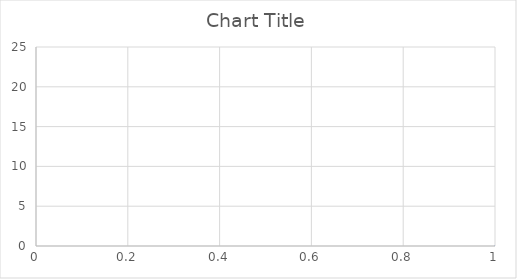
| Category | Series 0 |
|---|---|
| 0 | 0 |
| 1 | 19.247 |
| 2 | 19.247 |
| 3 | 19.247 |
| 4 | 19.247 |
| 5 | 19.247 |
| 6 | 19.246 |
| 7 | 19.25 |
| 8 | 19.254 |
| 9 | 19.244 |
| 10 | 19.249 |
| 11 | 19.253 |
| 12 | 19.253 |
| 13 | 19.253 |
| 14 | 19.253 |
| 15 | 19.252 |
| 16 | 19.252 |
| 17 | 19.252 |
| 18 | 19.252 |
| 19 | 19.252 |
| 20 | 19.253 |
| 21 | 19.253 |
| 22 | 19.253 |
| 23 | 19.252 |
| 24 | 19.252 |
| 25 | 19.253 |
| 26 | 19.252 |
| 27 | 19.252 |
| 28 | 19.252 |
| 29 | 19.251 |
| 30 | 19.251 |
| 31 | 19.251 |
| 32 | 19.251 |
| 33 | 19.25 |
| 34 | 19.25 |
| 35 | 19.25 |
| 36 | 19.25 |
| 37 | 19.25 |
| 38 | 19.25 |
| 39 | 19.251 |
| 40 | 19.252 |
| 41 | 19.253 |
| 42 | 19.253 |
| 43 | 19.254 |
| 44 | 19.254 |
| 45 | 19.254 |
| 46 | 19.254 |
| 47 | 19.25 |
| 48 | 19.246 |
| 49 | 19.255 |
| 50 | 19.251 |
| 51 | 19.247 |
| 52 | 19.247 |
| 53 | 19.251 |
| 54 | 19.255 |
| 55 | 19.254 |
| 56 | 19.254 |
| 57 | 19.254 |
| 58 | 19.254 |
| 59 | 19.254 |
| 60 | 19.254 |
| 61 | 19.254 |
| 62 | 19.249 |
| 63 | 19.244 |
| 64 | 19.254 |
| 65 | 19.253 |
| 66 | 19.253 |
| 67 | 19.252 |
| 68 | 19.252 |
| 69 | 19.252 |
| 70 | 19.251 |
| 71 | 19.251 |
| 72 | 19.251 |
| 73 | 19.251 |
| 74 | 19.25 |
| 75 | 19.25 |
| 76 | 19.25 |
| 77 | 19.25 |
| 78 | 19.25 |
| 79 | 19.254 |
| 80 | 19.259 |
| 81 | 19.25 |
| 82 | 19.25 |
| 83 | 19.25 |
| 84 | 19.25 |
| 85 | 19.254 |
| 86 | 19.259 |
| 87 | 19.25 |
| 88 | 19.249 |
| 89 | 19.249 |
| 90 | 19.249 |
| 91 | 19.249 |
| 92 | 19.248 |
| 93 | 19.248 |
| 94 | 19.248 |
| 95 | 19.248 |
| 96 | 19.248 |
| 97 | 19.248 |
| 98 | 19.247 |
| 99 | 19.247 |
| 100 | 19.247 |
| 101 | 19.248 |
| 102 | 19.248 |
| 103 | 19.248 |
| 104 | 19.248 |
| 105 | 19.248 |
| 106 | 19.248 |
| 107 | 19.248 |
| 108 | 19.248 |
| 109 | 19.247 |
| 110 | 19.248 |
| 111 | 19.248 |
| 112 | 19.247 |
| 113 | 19.247 |
| 114 | 19.246 |
| 115 | 19.246 |
| 116 | 19.244 |
| 117 | 19.244 |
| 118 | 19.244 |
| 119 | 19.251 |
| 120 | 19.251 |
| 121 | 19.251 |
| 122 | 19.249 |
| 123 | 19.249 |
| 124 | 19.248 |
| 125 | 19.248 |
| 126 | 19.247 |
| 127 | 19.247 |
| 128 | 19.246 |
| 129 | 19.246 |
| 130 | 19.245 |
| 131 | 19.244 |
| 132 | 19.244 |
| 133 | 19.253 |
| 134 | 19.253 |
| 135 | 19.252 |
| 136 | 19.252 |
| 137 | 19.251 |
| 138 | 19.251 |
| 139 | 19.25 |
| 140 | 19.25 |
| 141 | 19.25 |
| 142 | 19.249 |
| 143 | 19.249 |
| 144 | 19.248 |
| 145 | 19.248 |
| 146 | 19.247 |
| 147 | 19.247 |
| 148 | 19.247 |
| 149 | 19.247 |
| 150 | 19.246 |
| 151 | 19.246 |
| 152 | 19.246 |
| 153 | 19.246 |
| 154 | 19.246 |
| 155 | 19.245 |
| 156 | 19.254 |
| 157 | 19.254 |
| 158 | 19.254 |
| 159 | 19.254 |
| 160 | 19.254 |
| 161 | 19.254 |
| 162 | 19.254 |
| 163 | 19.254 |
| 164 | 19.254 |
| 165 | 19.254 |
| 166 | 19.25 |
| 167 | 19.245 |
| 168 | 19.254 |
| 169 | 19.254 |
| 170 | 19.254 |
| 171 | 19.253 |
| 172 | 19.253 |
| 173 | 19.253 |
| 174 | 19.252 |
| 175 | 19.252 |
| 176 | 19.251 |
| 177 | 19.251 |
| 178 | 19.251 |
| 179 | 19.25 |
| 180 | 19.25 |
| 181 | 19.25 |
| 182 | 19.249 |
| 183 | 19.249 |
| 184 | 19.249 |
| 185 | 19.248 |
| 186 | 19.248 |
| 187 | 19.248 |
| 188 | 19.247 |
| 189 | 19.247 |
| 190 | 19.247 |
| 191 | 19.247 |
| 192 | 19.247 |
| 193 | 19.247 |
| 194 | 19.246 |
| 195 | 19.246 |
| 196 | 19.246 |
| 197 | 19.246 |
| 198 | 19.246 |
| 199 | 19.246 |
| 200 | 19.247 |
| 201 | 19.246 |
| 202 | 19.246 |
| 203 | 19.246 |
| 204 | 19.246 |
| 205 | 19.255 |
| 206 | 19.251 |
| 207 | 19.246 |
| 208 | 19.247 |
| 209 | 19.246 |
| 210 | 19.246 |
| 211 | 19.246 |
| 212 | 19.246 |
| 213 | 19.246 |
| 214 | 19.247 |
| 215 | 19.246 |
| 216 | 19.246 |
| 217 | 19.247 |
| 218 | 19.247 |
| 219 | 19.247 |
| 220 | 19.247 |
| 221 | 19.251 |
| 222 | 19.255 |
| 223 | 19.255 |
| 224 | 19.25 |
| 225 | 19.245 |
| 226 | 19.254 |
| 227 | 19.254 |
| 228 | 19.254 |
| 229 | 19.249 |
| 230 | 19.244 |
| 231 | 19.253 |
| 232 | 19.252 |
| 233 | 19.252 |
| 234 | 19.252 |
| 235 | 19.252 |
| 236 | 19.252 |
| 237 | 19.251 |
| 238 | 19.251 |
| 239 | 19.251 |
| 240 | 19.251 |
| 241 | 19.251 |
| 242 | 19.251 |
| 243 | 19.251 |
| 244 | 19.251 |
| 245 | 19.251 |
| 246 | 19.251 |
| 247 | 19.251 |
| 248 | 19.251 |
| 249 | 19.251 |
| 250 | 19.251 |
| 251 | 19.251 |
| 252 | 19.251 |
| 253 | 19.251 |
| 254 | 19.251 |
| 255 | 19.251 |
| 256 | 19.251 |
| 257 | 19.251 |
| 258 | 19.25 |
| 259 | 19.25 |
| 260 | 19.25 |
| 261 | 19.25 |
| 262 | 19.25 |
| 263 | 19.25 |
| 264 | 19.25 |
| 265 | 19.25 |
| 266 | 19.25 |
| 267 | 19.25 |
| 268 | 19.251 |
| 269 | 19.251 |
| 270 | 19.251 |
| 271 | 19.251 |
| 272 | 19.252 |
| 273 | 19.252 |
| 274 | 19.252 |
| 275 | 19.253 |
| 276 | 19.253 |
| 277 | 19.253 |
| 278 | 19.244 |
| 279 | 19.244 |
| 280 | 19.253 |
| 281 | 19.253 |
| 282 | 19.253 |
| 283 | 19.243 |
| 284 | 19.248 |
| 285 | 19.252 |
| 286 | 19.252 |
| 287 | 19.252 |
| 288 | 19.252 |
| 289 | 19.251 |
| 290 | 19.251 |
| 291 | 19.251 |
| 292 | 19.251 |
| 293 | 19.25 |
| 294 | 19.25 |
| 295 | 19.25 |
| 296 | 19.25 |
| 297 | 19.25 |
| 298 | 19.25 |
| 299 | 19.249 |
| 300 | 19.249 |
| 301 | 19.249 |
| 302 | 19.249 |
| 303 | 19.249 |
| 304 | 19.249 |
| 305 | 19.249 |
| 306 | 19.248 |
| 307 | 19.248 |
| 308 | 19.248 |
| 309 | 19.248 |
| 310 | 19.247 |
| 311 | 19.247 |
| 312 | 19.247 |
| 313 | 19.252 |
| 314 | 19.256 |
| 315 | 19.248 |
| 316 | 19.248 |
| 317 | 19.248 |
| 318 | 19.248 |
| 319 | 19.248 |
| 320 | 19.248 |
| 321 | 19.248 |
| 322 | 19.248 |
| 323 | 19.248 |
| 324 | 19.248 |
| 325 | 19.248 |
| 326 | 19.249 |
| 327 | 19.25 |
| 328 | 19.249 |
| 329 | 19.249 |
| 330 | 19.249 |
| 331 | 19.249 |
| 332 | 19.248 |
| 333 | 19.249 |
| 334 | 19.249 |
| 335 | 19.248 |
| 336 | 19.248 |
| 337 | 19.248 |
| 338 | 19.256 |
| 339 | 19.252 |
| 340 | 19.247 |
| 341 | 19.247 |
| 342 | 19.247 |
| 343 | 19.247 |
| 344 | 19.247 |
| 345 | 19.247 |
| 346 | 19.247 |
| 347 | 19.256 |
| 348 | 19.256 |
| 349 | 19.256 |
| 350 | 19.256 |
| 351 | 19.256 |
| 352 | 19.256 |
| 353 | 19.247 |
| 354 | 19.252 |
| 355 | 19.257 |
| 356 | 19.252 |
| 357 | 19.248 |
| 358 | 19.248 |
| 359 | 19.247 |
| 360 | 19.247 |
| 361 | 19.247 |
| 362 | 19.247 |
| 363 | 19.247 |
| 364 | 19.256 |
| 365 | 19.252 |
| 366 | 19.248 |
| 367 | 19.248 |
| 368 | 19.248 |
| 369 | 19.248 |
| 370 | 19.249 |
| 371 | 19.249 |
| 372 | 19.25 |
| 373 | 19.25 |
| 374 | 19.25 |
| 375 | 19.251 |
| 376 | 19.251 |
| 377 | 19.251 |
| 378 | 19.252 |
| 379 | 19.253 |
| 380 | 19.253 |
| 381 | 19.253 |
| 382 | 19.254 |
| 383 | 19.254 |
| 384 | 19.254 |
| 385 | 19.255 |
| 386 | 19.255 |
| 387 | 19.255 |
| 388 | 19.251 |
| 389 | 19.247 |
| 390 | 19.246 |
| 391 | 19.246 |
| 392 | 19.246 |
| 393 | 19.254 |
| 394 | 19.25 |
| 395 | 19.245 |
| 396 | 19.245 |
| 397 | 19.249 |
| 398 | 19.254 |
| 399 | 19.254 |
| 400 | 19.254 |
| 401 | 19.254 |
| 402 | 19.254 |
| 403 | 19.254 |
| 404 | 19.254 |
| 405 | 19.254 |
| 406 | 19.254 |
| 407 | 19.254 |
| 408 | 19.254 |
| 409 | 19.254 |
| 410 | 19.254 |
| 411 | 19.254 |
| 412 | 19.254 |
| 413 | 19.255 |
| 414 | 19.255 |
| 415 | 19.255 |
| 416 | 19.255 |
| 417 | 19.256 |
| 418 | 19.256 |
| 419 | 19.246 |
| 420 | 19.251 |
| 421 | 19.255 |
| 422 | 19.245 |
| 423 | 19.25 |
| 424 | 19.254 |
| 425 | 19.254 |
| 426 | 19.253 |
| 427 | 19.253 |
| 428 | 19.253 |
| 429 | 19.253 |
| 430 | 19.253 |
| 431 | 19.253 |
| 432 | 19.252 |
| 433 | 19.252 |
| 434 | 19.252 |
| 435 | 19.252 |
| 436 | 19.252 |
| 437 | 19.251 |
| 438 | 19.251 |
| 439 | 19.251 |
| 440 | 19.251 |
| 441 | 19.251 |
| 442 | 19.25 |
| 443 | 19.25 |
| 444 | 19.25 |
| 445 | 19.249 |
| 446 | 19.249 |
| 447 | 19.248 |
| 448 | 19.248 |
| 449 | 19.248 |
| 450 | 19.248 |
| 451 | 19.248 |
| 452 | 19.247 |
| 453 | 19.247 |
| 454 | 19.247 |
| 455 | 19.247 |
| 456 | 19.247 |
| 457 | 19.256 |
| 458 | 19.256 |
| 459 | 19.255 |
| 460 | 19.251 |
| 461 | 19.246 |
| 462 | 19.246 |
| 463 | 19.245 |
| 464 | 19.245 |
| 465 | 19.245 |
| 466 | 19.249 |
| 467 | 19.253 |
| 468 | 19.253 |
| 469 | 19.249 |
| 470 | 19.244 |
| 471 | 19.253 |
| 472 | 19.252 |
| 473 | 19.252 |
| 474 | 19.252 |
| 475 | 19.252 |
| 476 | 19.252 |
| 477 | 19.251 |
| 478 | 19.251 |
| 479 | 19.251 |
| 480 | 19.25 |
| 481 | 19.25 |
| 482 | 19.25 |
| 483 | 19.25 |
| 484 | 19.25 |
| 485 | 19.25 |
| 486 | 19.249 |
| 487 | 19.249 |
| 488 | 19.249 |
| 489 | 19.249 |
| 490 | 19.249 |
| 491 | 19.248 |
| 492 | 19.248 |
| 493 | 19.248 |
| 494 | 19.248 |
| 495 | 19.248 |
| 496 | 19.247 |
| 497 | 19.247 |
| 498 | 19.247 |
| 499 | 19.247 |
| 500 | 19.246 |
| 501 | 19.246 |
| 502 | 19.246 |
| 503 | 19.245 |
| 504 | 19.245 |
| 505 | 19.245 |
| 506 | 19.254 |
| 507 | 19.254 |
| 508 | 19.254 |
| 509 | 19.244 |
| 510 | 19.249 |
| 511 | 19.253 |
| 512 | 19.244 |
| 513 | 19.249 |
| 514 | 19.253 |
| 515 | 19.253 |
| 516 | 19.253 |
| 517 | 19.253 |
| 518 | 19.253 |
| 519 | 19.253 |
| 520 | 19.253 |
| 521 | 19.253 |
| 522 | 19.253 |
| 523 | 19.252 |
| 524 | 19.252 |
| 525 | 19.252 |
| 526 | 19.251 |
| 527 | 19.251 |
| 528 | 19.251 |
| 529 | 19.25 |
| 530 | 19.25 |
| 531 | 19.25 |
| 532 | 19.249 |
| 533 | 19.249 |
| 534 | 19.249 |
| 535 | 19.249 |
| 536 | 19.249 |
| 537 | 19.249 |
| 538 | 19.249 |
| 539 | 19.249 |
| 540 | 19.249 |
| 541 | 19.249 |
| 542 | 19.249 |
| 543 | 19.249 |
| 544 | 19.249 |
| 545 | 19.249 |
| 546 | 19.249 |
| 547 | 19.249 |
| 548 | 19.249 |
| 549 | 19.249 |
| 550 | 19.249 |
| 551 | 19.249 |
| 552 | 19.249 |
| 553 | 19.249 |
| 554 | 19.249 |
| 555 | 19.249 |
| 556 | 19.249 |
| 557 | 19.249 |
| 558 | 19.249 |
| 559 | 19.249 |
| 560 | 19.249 |
| 561 | 19.248 |
| 562 | 19.248 |
| 563 | 19.248 |
| 564 | 19.248 |
| 565 | 19.248 |
| 566 | 19.248 |
| 567 | 19.248 |
| 568 | 19.248 |
| 569 | 19.248 |
| 570 | 19.248 |
| 571 | 19.248 |
| 572 | 19.247 |
| 573 | 19.247 |
| 574 | 19.247 |
| 575 | 19.247 |
| 576 | 19.247 |
| 577 | 19.247 |
| 578 | 19.246 |
| 579 | 19.246 |
| 580 | 19.246 |
| 581 | 19.246 |
| 582 | 19.246 |
| 583 | 19.246 |
| 584 | 19.256 |
| 585 | 19.251 |
| 586 | 19.246 |
| 587 | 19.246 |
| 588 | 19.246 |
| 589 | 19.246 |
| 590 | 19.246 |
| 591 | 19.246 |
| 592 | 19.246 |
| 593 | 19.246 |
| 594 | 19.246 |
| 595 | 19.255 |
| 596 | 19.251 |
| 597 | 19.246 |
| 598 | 19.246 |
| 599 | 19.246 |
| 600 | 19.246 |
| 601 | 19.247 |
| 602 | 19.247 |
| 603 | 19.247 |
| 604 | 19.247 |
| 605 | 19.247 |
| 606 | 19.247 |
| 607 | 19.248 |
| 608 | 19.248 |
| 609 | 19.248 |
| 610 | 19.248 |
| 611 | 19.248 |
| 612 | 19.248 |
| 613 | 19.248 |
| 614 | 19.248 |
| 615 | 19.248 |
| 616 | 19.249 |
| 617 | 19.249 |
| 618 | 19.249 |
| 619 | 19.249 |
| 620 | 19.249 |
| 621 | 19.249 |
| 622 | 19.249 |
| 623 | 19.25 |
| 624 | 19.25 |
| 625 | 19.25 |
| 626 | 19.25 |
| 627 | 19.251 |
| 628 | 19.251 |
| 629 | 19.251 |
| 630 | 19.251 |
| 631 | 19.251 |
| 632 | 19.252 |
| 633 | 19.252 |
| 634 | 19.252 |
| 635 | 19.252 |
| 636 | 19.252 |
| 637 | 19.251 |
| 638 | 19.251 |
| 639 | 19.251 |
| 640 | 19.251 |
| 641 | 19.251 |
| 642 | 19.251 |
| 643 | 19.251 |
| 644 | 19.251 |
| 645 | 19.251 |
| 646 | 19.251 |
| 647 | 19.251 |
| 648 | 19.251 |
| 649 | 19.251 |
| 650 | 19.251 |
| 651 | 19.251 |
| 652 | 19.251 |
| 653 | 19.25 |
| 654 | 19.25 |
| 655 | 19.25 |
| 656 | 19.25 |
| 657 | 19.25 |
| 658 | 19.249 |
| 659 | 19.249 |
| 660 | 19.249 |
| 661 | 19.248 |
| 662 | 19.248 |
| 663 | 19.248 |
| 664 | 19.247 |
| 665 | 19.246 |
| 666 | 19.246 |
| 667 | 19.246 |
| 668 | 19.245 |
| 669 | 19.245 |
| 670 | 19.244 |
| 671 | 19.139 |
| 672 | 19.033 |
| 673 | 19.094 |
| 674 | 19.034 |
| 675 | 18.974 |
| 676 | 18.97 |
| 677 | 18.999 |
| 678 | 19.029 |
| 679 | 19.071 |
| 680 | 19.092 |
| 681 | 19.113 |
| 682 | 19.15 |
| 683 | 19.167 |
| 684 | 19.183 |
| 685 | 19.212 |
| 686 | 19.21 |
| 687 | 19.207 |
| 688 | 19.204 |
| 689 | 19.21 |
| 690 | 19.216 |
| 691 | 19.221 |
| 692 | 19.221 |
| 693 | 19.227 |
| 694 | 19.239 |
| 695 | 19.238 |
| 696 | 19.236 |
| 697 | 19.239 |
| 698 | 19.242 |
| 699 | 19.249 |
| 700 | 19.254 |
| 701 | 19.259 |
| 702 | 19.263 |
| 703 | 19.266 |
| 704 | 19.269 |
| 705 | 19.268 |
| 706 | 19.272 |
| 707 | 19.277 |
| 708 | 19.277 |
| 709 | 19.277 |
| 710 | 19.277 |
| 711 | 19.277 |
| 712 | 19.272 |
| 713 | 19.267 |
| 714 | 19.268 |
| 715 | 19.263 |
| 716 | 19.259 |
| 717 | 19.259 |
| 718 | 19.255 |
| 719 | 19.25 |
| 720 | 19.241 |
| 721 | 19.241 |
| 722 | 19.241 |
| 723 | 19.24 |
| 724 | 19.235 |
| 725 | 19.231 |
| 726 | 19.23 |
| 727 | 19.23 |
| 728 | 19.23 |
| 729 | 19.23 |
| 730 | 19.23 |
| 731 | 19.23 |
| 732 | 19.23 |
| 733 | 19.231 |
| 734 | 19.24 |
| 735 | 19.241 |
| 736 | 19.241 |
| 737 | 19.25 |
| 738 | 19.246 |
| 739 | 19.241 |
| 740 | 19.25 |
| 741 | 19.255 |
| 742 | 19.259 |
| 743 | 19.249 |
| 744 | 19.249 |
| 745 | 19.249 |
| 746 | 19.249 |
| 747 | 19.249 |
| 748 | 19.249 |
| 749 | 19.249 |
| 750 | 19.25 |
| 751 | 19.25 |
| 752 | 19.25 |
| 753 | 19.25 |
| 754 | 19.251 |
| 755 | 19.252 |
| 756 | 19.252 |
| 757 | 19.262 |
| 758 | 19.262 |
| 759 | 19.262 |
| 760 | 19.262 |
| 761 | 19.262 |
| 762 | 19.261 |
| 763 | 19.261 |
| 764 | 19.261 |
| 765 | 19.261 |
| 766 | 19.26 |
| 767 | 19.26 |
| 768 | 19.26 |
| 769 | 19.251 |
| 770 | 19.256 |
| 771 | 19.26 |
| 772 | 19.26 |
| 773 | 19.26 |
| 774 | 19.26 |
| 775 | 19.251 |
| 776 | 19.256 |
| 777 | 19.26 |
| 778 | 19.26 |
| 779 | 19.26 |
| 780 | 19.26 |
| 781 | 19.26 |
| 782 | 19.26 |
| 783 | 19.259 |
| 784 | 19.264 |
| 785 | 19.268 |
| 786 | 19.259 |
| 787 | 19.259 |
| 788 | 19.259 |
| 789 | 19.259 |
| 790 | 19.259 |
| 791 | 19.259 |
| 792 | 19.259 |
| 793 | 19.259 |
| 794 | 19.26 |
| 795 | 19.26 |
| 796 | 19.26 |
| 797 | 19.26 |
| 798 | 19.26 |
| 799 | 19.26 |
| 800 | 19.259 |
| 801 | 19.268 |
| 802 | 19.268 |
| 803 | 19.268 |
| 804 | 19.268 |
| 805 | 19.268 |
| 806 | 19.268 |
| 807 | 19.264 |
| 808 | 19.259 |
| 809 | 19.269 |
| 810 | 19.264 |
| 811 | 19.26 |
| 812 | 19.26 |
| 813 | 19.261 |
| 814 | 19.261 |
| 815 | 19.262 |
| 816 | 19.262 |
| 817 | 19.262 |
| 818 | 19.263 |
| 819 | 19.263 |
| 820 | 19.263 |
| 821 | 19.263 |
| 822 | 19.263 |
| 823 | 19.263 |
| 824 | 19.263 |
| 825 | 19.263 |
| 826 | 19.263 |
| 827 | 19.263 |
| 828 | 19.263 |
| 829 | 19.264 |
| 830 | 19.265 |
| 831 | 19.265 |
| 832 | 19.265 |
| 833 | 19.266 |
| 834 | 19.267 |
| 835 | 19.268 |
| 836 | 19.269 |
| 837 | 19.27 |
| 838 | 19.262 |
| 839 | 19.262 |
| 840 | 19.263 |
| 841 | 19.263 |
| 842 | 19.268 |
| 843 | 19.273 |
| 844 | 19.273 |
| 845 | 19.273 |
| 846 | 19.273 |
| 847 | 19.273 |
| 848 | 19.273 |
| 849 | 19.272 |
| 850 | 19.272 |
| 851 | 19.272 |
| 852 | 19.272 |
| 853 | 19.271 |
| 854 | 19.271 |
| 855 | 19.271 |
| 856 | 19.272 |
| 857 | 19.272 |
| 858 | 19.272 |
| 859 | 19.272 |
| 860 | 19.272 |
| 861 | 19.273 |
| 862 | 19.273 |
| 863 | 19.273 |
| 864 | 19.282 |
| 865 | 19.278 |
| 866 | 19.273 |
| 867 | 19.273 |
| 868 | 19.273 |
| 869 | 19.273 |
| 870 | 19.274 |
| 871 | 19.278 |
| 872 | 19.283 |
| 873 | 19.283 |
| 874 | 19.278 |
| 875 | 19.274 |
| 876 | 19.283 |
| 877 | 19.278 |
| 878 | 19.273 |
| 879 | 19.273 |
| 880 | 19.278 |
| 881 | 19.283 |
| 882 | 19.283 |
| 883 | 19.283 |
| 884 | 19.283 |
| 885 | 19.279 |
| 886 | 19.274 |
| 887 | 19.284 |
| 888 | 19.28 |
| 889 | 19.275 |
| 890 | 19.285 |
| 891 | 19.281 |
| 892 | 19.277 |
| 893 | 19.277 |
| 894 | 19.278 |
| 895 | 19.278 |
| 896 | 19.279 |
| 897 | 19.279 |
| 898 | 19.28 |
| 899 | 19.289 |
| 900 | 19.285 |
| 901 | 19.28 |
| 902 | 19.289 |
| 903 | 19.285 |
| 904 | 19.281 |
| 905 | 19.281 |
| 906 | 19.281 |
| 907 | 19.282 |
| 908 | 19.283 |
| 909 | 19.284 |
| 910 | 19.285 |
| 911 | 19.286 |
| 912 | 19.287 |
| 913 | 19.288 |
| 914 | 19.289 |
| 915 | 19.29 |
| 916 | 19.282 |
| 917 | 19.283 |
| 918 | 19.284 |
| 919 | 19.284 |
| 920 | 19.285 |
| 921 | 19.285 |
| 922 | 19.295 |
| 923 | 19.295 |
| 924 | 19.295 |
| 925 | 19.294 |
| 926 | 19.294 |
| 927 | 19.294 |
| 928 | 19.284 |
| 929 | 19.285 |
| 930 | 19.285 |
| 931 | 19.295 |
| 932 | 19.291 |
| 933 | 19.287 |
| 934 | 19.289 |
| 935 | 19.289 |
| 936 | 19.29 |
| 937 | 19.29 |
| 938 | 19.29 |
| 939 | 19.291 |
| 940 | 19.291 |
| 941 | 19.291 |
| 942 | 19.29 |
| 943 | 19.295 |
| 944 | 19.299 |
| 945 | 19.298 |
| 946 | 19.297 |
| 947 | 19.297 |
| 948 | 19.296 |
| 949 | 19.296 |
| 950 | 19.295 |
| 951 | 19.295 |
| 952 | 19.296 |
| 953 | 19.297 |
| 954 | 19.298 |
| 955 | 19.298 |
| 956 | 19.299 |
| 957 | 19.291 |
| 958 | 19.296 |
| 959 | 19.301 |
| 960 | 19.302 |
| 961 | 19.302 |
| 962 | 19.303 |
| 963 | 19.303 |
| 964 | 19.303 |
| 965 | 19.302 |
| 966 | 19.301 |
| 967 | 19.301 |
| 968 | 19.3 |
| 969 | 19.299 |
| 970 | 19.298 |
| 971 | 19.305 |
| 972 | 19.304 |
| 973 | 19.302 |
| 974 | 19.301 |
| 975 | 19.301 |
| 976 | 19.3 |
| 977 | 19.299 |
| 978 | 19.298 |
| 979 | 19.298 |
| 980 | 19.307 |
| 981 | 19.306 |
| 982 | 19.306 |
| 983 | 19.305 |
| 984 | 19.304 |
| 985 | 19.304 |
| 986 | 19.304 |
| 987 | 19.304 |
| 988 | 19.304 |
| 989 | 19.304 |
| 990 | 19.303 |
| 991 | 19.303 |
| 992 | 19.303 |
| 993 | 19.302 |
| 994 | 19.302 |
| 995 | 19.302 |
| 996 | 19.301 |
| 997 | 19.301 |
| 998 | 19.302 |
| 999 | 19.302 |
| 1000 | 19.302 |
| 1001 | 19.303 |
| 1002 | 19.303 |
| 1003 | 19.304 |
| 1004 | 19.304 |
| 1005 | 19.304 |
| 1006 | 19.305 |
| 1007 | 19.305 |
| 1008 | 19.305 |
| 1009 | 19.306 |
| 1010 | 19.306 |
| 1011 | 19.306 |
| 1012 | 19.307 |
| 1013 | 19.307 |
| 1014 | 19.307 |
| 1015 | 19.307 |
| 1016 | 19.307 |
| 1017 | 19.308 |
| 1018 | 19.308 |
| 1019 | 19.309 |
| 1020 | 19.31 |
| 1021 | 19.31 |
| 1022 | 19.31 |
| 1023 | 19.311 |
| 1024 | 19.312 |
| 1025 | 19.312 |
| 1026 | 19.313 |
| 1027 | 19.314 |
| 1028 | 19.315 |
| 1029 | 19.316 |
| 1030 | 19.316 |
| 1031 | 19.316 |
| 1032 | 19.309 |
| 1033 | 19.314 |
| 1034 | 19.32 |
| 1035 | 19.311 |
| 1036 | 19.312 |
| 1037 | 19.313 |
| 1038 | 19.305 |
| 1039 | 19.31 |
| 1040 | 19.316 |
| 1041 | 19.312 |
| 1042 | 19.308 |
| 1043 | 19.309 |
| 1044 | 19.311 |
| 1045 | 19.311 |
| 1046 | 19.312 |
| 1047 | 19.311 |
| 1048 | 19.311 |
| 1049 | 19.311 |
| 1050 | 19.311 |
| 1051 | 19.311 |
| 1052 | 19.311 |
| 1053 | 19.316 |
| 1054 | 19.321 |
| 1055 | 19.312 |
| 1056 | 19.312 |
| 1057 | 19.313 |
| 1058 | 19.314 |
| 1059 | 19.314 |
| 1060 | 19.315 |
| 1061 | 19.316 |
| 1062 | 19.316 |
| 1063 | 19.317 |
| 1064 | 19.318 |
| 1065 | 19.314 |
| 1066 | 19.309 |
| 1067 | 19.31 |
| 1068 | 19.311 |
| 1069 | 19.312 |
| 1070 | 19.313 |
| 1071 | 19.313 |
| 1072 | 19.314 |
| 1073 | 19.315 |
| 1074 | 19.315 |
| 1075 | 19.315 |
| 1076 | 19.316 |
| 1077 | 19.316 |
| 1078 | 19.317 |
| 1079 | 19.317 |
| 1080 | 19.318 |
| 1081 | 19.318 |
| 1082 | 19.318 |
| 1083 | 19.318 |
| 1084 | 19.319 |
| 1085 | 19.319 |
| 1086 | 19.319 |
| 1087 | 19.318 |
| 1088 | 19.317 |
| 1089 | 19.317 |
| 1090 | 19.317 |
| 1091 | 19.317 |
| 1092 | 19.317 |
| 1093 | 19.317 |
| 1094 | 19.317 |
| 1095 | 19.316 |
| 1096 | 19.316 |
| 1097 | 19.315 |
| 1098 | 19.315 |
| 1099 | 19.315 |
| 1100 | 19.315 |
| 1101 | 19.325 |
| 1102 | 19.324 |
| 1103 | 19.324 |
| 1104 | 19.323 |
| 1105 | 19.323 |
| 1106 | 19.323 |
| 1107 | 19.323 |
| 1108 | 19.323 |
| 1109 | 19.323 |
| 1110 | 19.323 |
| 1111 | 19.323 |
| 1112 | 19.323 |
| 1113 | 19.324 |
| 1114 | 19.323 |
| 1115 | 19.323 |
| 1116 | 19.323 |
| 1117 | 19.323 |
| 1118 | 19.323 |
| 1119 | 19.323 |
| 1120 | 19.323 |
| 1121 | 19.323 |
| 1122 | 19.323 |
| 1123 | 19.323 |
| 1124 | 19.323 |
| 1125 | 19.323 |
| 1126 | 19.323 |
| 1127 | 19.324 |
| 1128 | 19.329 |
| 1129 | 19.333 |
| 1130 | 19.324 |
| 1131 | 19.324 |
| 1132 | 19.324 |
| 1133 | 19.322 |
| 1134 | 19.322 |
| 1135 | 19.322 |
| 1136 | 19.33 |
| 1137 | 19.33 |
| 1138 | 19.329 |
| 1139 | 19.328 |
| 1140 | 19.327 |
| 1141 | 19.327 |
| 1142 | 19.326 |
| 1143 | 19.325 |
| 1144 | 19.325 |
| 1145 | 19.325 |
| 1146 | 19.324 |
| 1147 | 19.333 |
| 1148 | 19.328 |
| 1149 | 19.323 |
| 1150 | 19.331 |
| 1151 | 19.331 |
| 1152 | 19.331 |
| 1153 | 19.331 |
| 1154 | 19.332 |
| 1155 | 19.332 |
| 1156 | 19.333 |
| 1157 | 19.333 |
| 1158 | 19.334 |
| 1159 | 19.334 |
| 1160 | 19.334 |
| 1161 | 19.334 |
| 1162 | 19.334 |
| 1163 | 19.335 |
| 1164 | 19.335 |
| 1165 | 19.335 |
| 1166 | 19.336 |
| 1167 | 19.336 |
| 1168 | 19.327 |
| 1169 | 19.328 |
| 1170 | 19.329 |
| 1171 | 19.329 |
| 1172 | 19.33 |
| 1173 | 19.331 |
| 1174 | 19.332 |
| 1175 | 19.332 |
| 1176 | 19.334 |
| 1177 | 19.335 |
| 1178 | 19.335 |
| 1179 | 19.327 |
| 1180 | 19.327 |
| 1181 | 19.328 |
| 1182 | 19.329 |
| 1183 | 19.33 |
| 1184 | 19.33 |
| 1185 | 19.332 |
| 1186 | 19.332 |
| 1187 | 19.332 |
| 1188 | 19.333 |
| 1189 | 19.334 |
| 1190 | 19.335 |
| 1191 | 19.337 |
| 1192 | 19.333 |
| 1193 | 19.329 |
| 1194 | 19.333 |
| 1195 | 19.334 |
| 1196 | 19.335 |
| 1197 | 19.338 |
| 1198 | 19.334 |
| 1199 | 19.33 |
| 1200 | 19.336 |
| 1201 | 19.341 |
| 1202 | 19.333 |
| 1203 | 19.334 |
| 1204 | 19.335 |
| 1205 | 19.336 |
| 1206 | 19.337 |
| 1207 | 19.338 |
| 1208 | 19.33 |
| 1209 | 19.33 |
| 1210 | 19.331 |
| 1211 | 19.334 |
| 1212 | 19.336 |
| 1213 | 19.337 |
| 1214 | 19.339 |
| 1215 | 19.34 |
| 1216 | 19.34 |
| 1217 | 19.341 |
| 1218 | 19.342 |
| 1219 | 19.342 |
| 1220 | 19.335 |
| 1221 | 19.335 |
| 1222 | 19.336 |
| 1223 | 19.338 |
| 1224 | 19.339 |
| 1225 | 19.339 |
| 1226 | 19.34 |
| 1227 | 19.34 |
| 1228 | 19.341 |
| 1229 | 19.342 |
| 1230 | 19.342 |
| 1231 | 19.341 |
| 1232 | 19.341 |
| 1233 | 19.341 |
| 1234 | 19.34 |
| 1235 | 19.34 |
| 1236 | 19.34 |
| 1237 | 19.339 |
| 1238 | 19.344 |
| 1239 | 19.348 |
| 1240 | 19.338 |
| 1241 | 19.343 |
| 1242 | 19.347 |
| 1243 | 19.347 |
| 1244 | 19.347 |
| 1245 | 19.346 |
| 1246 | 19.344 |
| 1247 | 19.344 |
| 1248 | 19.343 |
| 1249 | 19.342 |
| 1250 | 19.342 |
| 1251 | 19.342 |
| 1252 | 19.342 |
| 1253 | 19.342 |
| 1254 | 19.341 |
| 1255 | 19.341 |
| 1256 | 19.34 |
| 1257 | 19.34 |
| 1258 | 19.344 |
| 1259 | 19.348 |
| 1260 | 19.339 |
| 1261 | 19.34 |
| 1262 | 19.34 |
| 1263 | 19.341 |
| 1264 | 19.341 |
| 1265 | 19.341 |
| 1266 | 19.341 |
| 1267 | 19.346 |
| 1268 | 19.35 |
| 1269 | 19.35 |
| 1270 | 19.35 |
| 1271 | 19.349 |
| 1272 | 19.339 |
| 1273 | 19.344 |
| 1274 | 19.348 |
| 1275 | 19.348 |
| 1276 | 19.348 |
| 1277 | 19.347 |
| 1278 | 19.347 |
| 1279 | 19.347 |
| 1280 | 19.338 |
| 1281 | 19.342 |
| 1282 | 19.346 |
| 1283 | 19.346 |
| 1284 | 19.346 |
| 1285 | 19.345 |
| 1286 | 19.344 |
| 1287 | 19.343 |
| 1288 | 19.343 |
| 1289 | 19.341 |
| 1290 | 19.34 |
| 1291 | 19.34 |
| 1292 | 19.339 |
| 1293 | 19.343 |
| 1294 | 19.347 |
| 1295 | 19.346 |
| 1296 | 19.346 |
| 1297 | 19.346 |
| 1298 | 19.345 |
| 1299 | 19.345 |
| 1300 | 19.344 |
| 1301 | 19.343 |
| 1302 | 19.343 |
| 1303 | 19.343 |
| 1304 | 19.343 |
| 1305 | 19.342 |
| 1306 | 19.341 |
| 1307 | 19.341 |
| 1308 | 19.341 |
| 1309 | 19.342 |
| 1310 | 19.341 |
| 1311 | 19.341 |
| 1312 | 19.341 |
| 1313 | 19.341 |
| 1314 | 19.341 |
| 1315 | 19.35 |
| 1316 | 19.35 |
| 1317 | 19.35 |
| 1318 | 19.35 |
| 1319 | 19.35 |
| 1320 | 19.35 |
| 1321 | 19.342 |
| 1322 | 19.342 |
| 1323 | 19.343 |
| 1324 | 19.344 |
| 1325 | 19.345 |
| 1326 | 19.345 |
| 1327 | 19.347 |
| 1328 | 19.348 |
| 1329 | 19.348 |
| 1330 | 19.349 |
| 1331 | 19.35 |
| 1332 | 19.351 |
| 1333 | 19.347 |
| 1334 | 19.344 |
| 1335 | 19.345 |
| 1336 | 19.345 |
| 1337 | 19.345 |
| 1338 | 19.347 |
| 1339 | 19.348 |
| 1340 | 19.349 |
| 1341 | 19.342 |
| 1342 | 19.344 |
| 1343 | 19.345 |
| 1344 | 19.347 |
| 1345 | 19.348 |
| 1346 | 19.349 |
| 1347 | 19.351 |
| 1348 | 19.348 |
| 1349 | 19.344 |
| 1350 | 19.347 |
| 1351 | 19.348 |
| 1352 | 19.35 |
| 1353 | 19.343 |
| 1354 | 19.344 |
| 1355 | 19.345 |
| 1356 | 19.346 |
| 1357 | 19.347 |
| 1358 | 19.341 |
| 1359 | 19.343 |
| 1360 | 19.344 |
| 1361 | 19.348 |
| 1362 | 19.349 |
| 1363 | 19.351 |
| 1364 | 19.345 |
| 1365 | 19.35 |
| 1366 | 19.35 |
| 1367 | 19.344 |
| 1368 | 19.346 |
| 1369 | 19.347 |
| 1370 | 19.348 |
| 1371 | 19.349 |
| 1372 | 19.35 |
| 1373 | 19.352 |
| 1374 | 19.348 |
| 1375 | 19.345 |
| 1376 | 19.346 |
| 1377 | 19.346 |
| 1378 | 19.346 |
| 1379 | 19.347 |
| 1380 | 19.349 |
| 1381 | 19.35 |
| 1382 | 19.35 |
| 1383 | 19.35 |
| 1384 | 19.349 |
| 1385 | 19.349 |
| 1386 | 19.349 |
| 1387 | 19.347 |
| 1388 | 19.347 |
| 1389 | 19.347 |
| 1390 | 19.349 |
| 1391 | 19.348 |
| 1392 | 19.347 |
| 1393 | 19.347 |
| 1394 | 19.347 |
| 1395 | 19.347 |
| 1396 | 19.347 |
| 1397 | 19.347 |
| 1398 | 19.346 |
| 1399 | 19.355 |
| 1400 | 19.351 |
| 1401 | 19.346 |
| 1402 | 19.354 |
| 1403 | 19.354 |
| 1404 | 19.353 |
| 1405 | 19.353 |
| 1406 | 19.352 |
| 1407 | 19.352 |
| 1408 | 19.352 |
| 1409 | 19.352 |
| 1410 | 19.352 |
| 1411 | 19.352 |
| 1412 | 19.353 |
| 1413 | 19.345 |
| 1414 | 19.347 |
| 1415 | 19.349 |
| 1416 | 19.343 |
| 1417 | 19.346 |
| 1418 | 19.348 |
| 1419 | 19.351 |
| 1420 | 19.353 |
| 1421 | 19.355 |
| 1422 | 19.348 |
| 1423 | 19.345 |
| 1424 | 19.342 |
| 1425 | 19.345 |
| 1426 | 19.347 |
| 1427 | 19.348 |
| 1428 | 19.35 |
| 1429 | 19.35 |
| 1430 | 19.35 |
| 1431 | 19.351 |
| 1432 | 19.351 |
| 1433 | 19.351 |
| 1434 | 19.352 |
| 1435 | 19.352 |
| 1436 | 19.354 |
| 1437 | 19.35 |
| 1438 | 19.347 |
| 1439 | 19.349 |
| 1440 | 19.349 |
| 1441 | 19.35 |
| 1442 | 19.353 |
| 1443 | 19.349 |
| 1444 | 19.345 |
| 1445 | 19.346 |
| 1446 | 19.348 |
| 1447 | 19.349 |
| 1448 | 19.352 |
| 1449 | 19.353 |
| 1450 | 19.353 |
| 1451 | 19.355 |
| 1452 | 19.351 |
| 1453 | 19.347 |
| 1454 | 19.348 |
| 1455 | 19.295 |
| 1456 | 19.241 |
| 1457 | 19.356 |
| 1458 | 19.347 |
| 1459 | 19.338 |
| 1460 | 19.335 |
| 1461 | 19.331 |
| 1462 | 19.337 |
| 1463 | 19.334 |
| 1464 | 19.33 |
| 1465 | 19.335 |
| 1466 | 19.339 |
| 1467 | 19.342 |
| 1468 | 19.352 |
| 1469 | 19.354 |
| 1470 | 19.356 |
| 1471 | 19.364 |
| 1472 | 19.364 |
| 1473 | 19.364 |
| 1474 | 19.372 |
| 1475 | 19.377 |
| 1476 | 19.381 |
| 1477 | 19.371 |
| 1478 | 19.371 |
| 1479 | 19.371 |
| 1480 | 19.37 |
| 1481 | 19.369 |
| 1482 | 19.368 |
| 1483 | 19.364 |
| 1484 | 19.365 |
| 1485 | 19.365 |
| 1486 | 19.367 |
| 1487 | 19.368 |
| 1488 | 19.364 |
| 1489 | 19.368 |
| 1490 | 19.371 |
| 1491 | 19.369 |
| 1492 | 19.369 |
| 1493 | 19.369 |
| 1494 | 19.37 |
| 1495 | 19.367 |
| 1496 | 19.364 |
| 1497 | 19.371 |
| 1498 | 19.366 |
| 1499 | 19.361 |
| 1500 | 19.362 |
| 1501 | 19.364 |
| 1502 | 19.366 |
| 1503 | 19.362 |
| 1504 | 19.352 |
| 1505 | 19.342 |
| 1506 | 19.342 |
| 1507 | 19.342 |
| 1508 | 19.342 |
| 1509 | 19.342 |
| 1510 | 19.342 |
| 1511 | 19.342 |
| 1512 | 19.342 |
| 1513 | 19.342 |
| 1514 | 19.343 |
| 1515 | 19.343 |
| 1516 | 19.343 |
| 1517 | 19.342 |
| 1518 | 19.342 |
| 1519 | 19.342 |
| 1520 | 19.343 |
| 1521 | 19.343 |
| 1522 | 19.343 |
| 1523 | 19.335 |
| 1524 | 19.34 |
| 1525 | 19.345 |
| 1526 | 19.337 |
| 1527 | 19.337 |
| 1528 | 19.337 |
| 1529 | 19.339 |
| 1530 | 19.339 |
| 1531 | 19.34 |
| 1532 | 19.342 |
| 1533 | 19.339 |
| 1534 | 19.336 |
| 1535 | 19.332 |
| 1536 | 19.329 |
| 1537 | 19.333 |
| 1538 | 19.335 |
| 1539 | 19.337 |
| 1540 | 19.332 |
| 1541 | 19.333 |
| 1542 | 19.335 |
| 1543 | 19.338 |
| 1544 | 19.339 |
| 1545 | 19.341 |
| 1546 | 19.342 |
| 1547 | 19.343 |
| 1548 | 19.344 |
| 1549 | 19.344 |
| 1550 | 19.344 |
| 1551 | 19.344 |
| 1552 | 19.342 |
| 1553 | 19.341 |
| 1554 | 19.341 |
| 1555 | 19.34 |
| 1556 | 19.34 |
| 1557 | 19.341 |
| 1558 | 19.341 |
| 1559 | 19.341 |
| 1560 | 19.342 |
| 1561 | 19.342 |
| 1562 | 19.342 |
| 1563 | 19.343 |
| 1564 | 19.343 |
| 1565 | 19.342 |
| 1566 | 19.342 |
| 1567 | 19.346 |
| 1568 | 19.35 |
| 1569 | 19.348 |